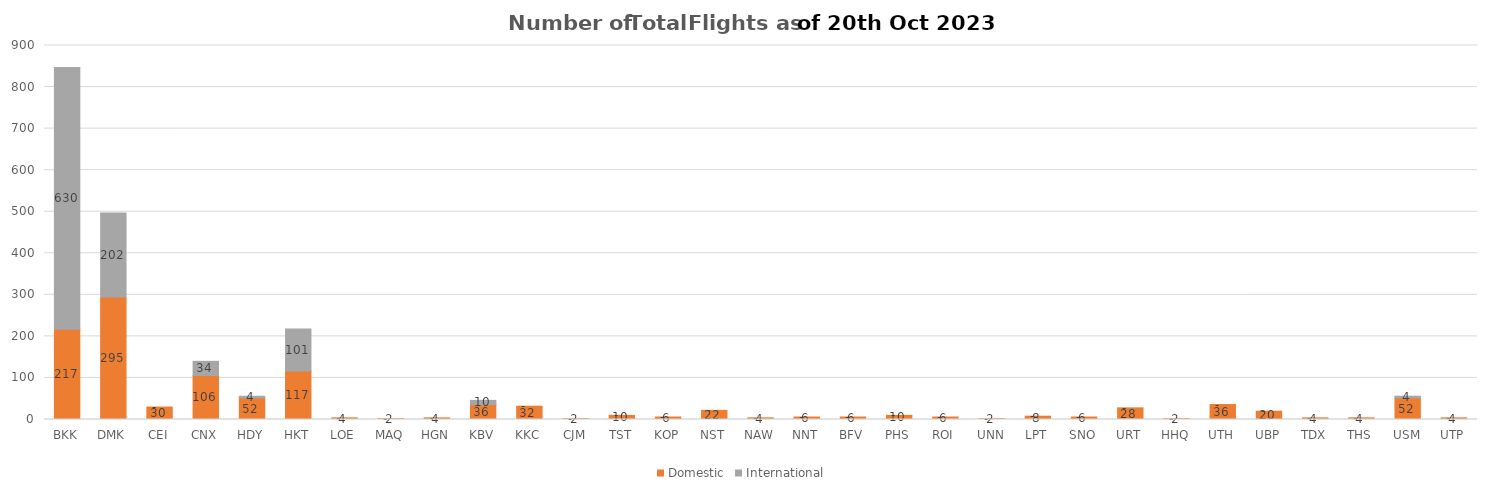
| Category | Domestic | International |
|---|---|---|
| BKK | 217 | 630 |
| DMK | 295 | 202 |
| CEI | 30 | 0 |
| CNX | 106 | 34 |
| HDY | 52 | 4 |
| HKT | 117 | 101 |
| LOE | 4 | 0 |
| MAQ | 2 | 0 |
| HGN | 4 | 0 |
| KBV | 36 | 10 |
| KKC | 32 | 0 |
| CJM | 2 | 0 |
| TST | 10 | 0 |
| KOP | 6 | 0 |
| NST | 22 | 0 |
| NAW | 4 | 0 |
| NNT | 6 | 0 |
| BFV | 6 | 0 |
| PHS | 10 | 0 |
| ROI | 6 | 0 |
| UNN | 2 | 0 |
| LPT | 8 | 0 |
| SNO | 6 | 0 |
| URT | 28 | 0 |
| HHQ | 2 | 0 |
| UTH | 36 | 0 |
| UBP | 20 | 0 |
| TDX | 4 | 0 |
| THS | 4 | 0 |
| USM | 52 | 4 |
| UTP | 4 | 0 |